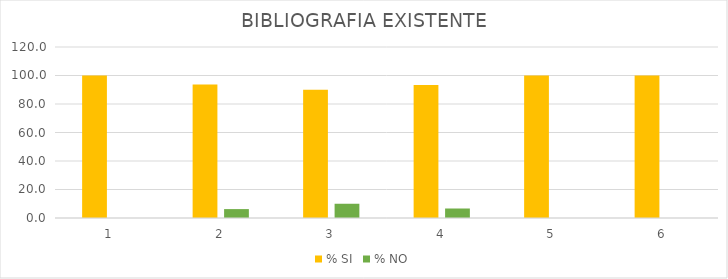
| Category | % SI | % NO |
|---|---|---|
| 0 | 100 | 0 |
| 1 | 93.75 | 6.25 |
| 2 | 90 | 10 |
| 3 | 93.333 | 6.667 |
| 4 | 100 | 0 |
| 5 | 100 | 0 |